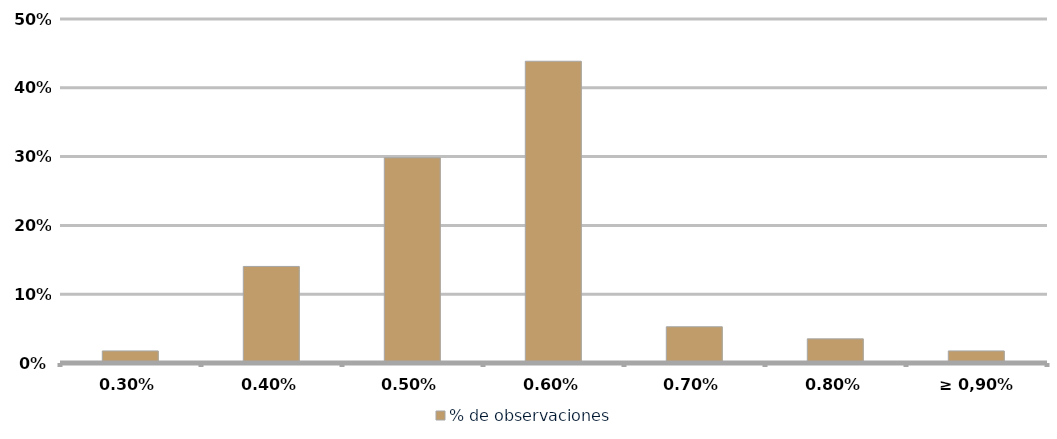
| Category | % de observaciones  |
|---|---|
| 0,30% | 0.018 |
| 0,40% | 0.14 |
| 0,50% | 0.298 |
| 0,60% | 0.439 |
| 0,70% | 0.053 |
| 0,80% | 0.035 |
| ≥ 0,90% | 0.018 |